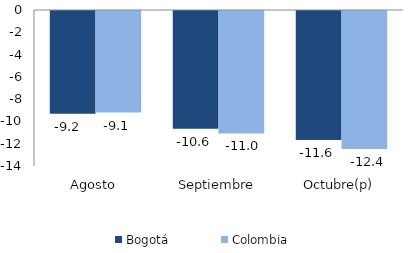
| Category | Bogotá | Colombia |
|---|---|---|
| Agosto | -9.223 | -9.118 |
| Septiembre | -10.559 | -10.987 |
| Octubre(p) | -11.566 | -12.382 |